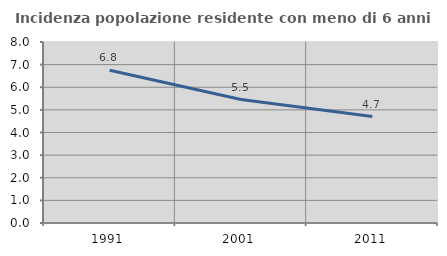
| Category | Incidenza popolazione residente con meno di 6 anni |
|---|---|
| 1991.0 | 6.755 |
| 2001.0 | 5.458 |
| 2011.0 | 4.706 |